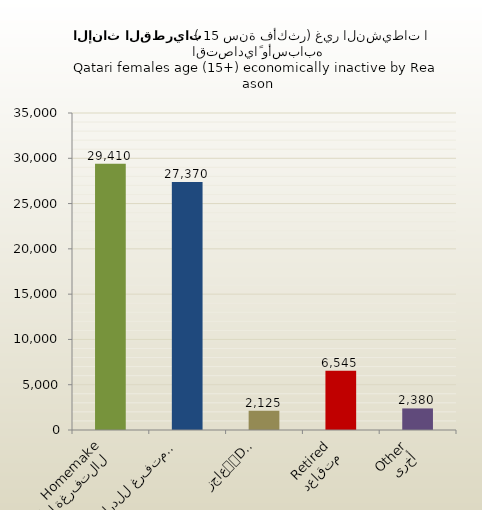
| Category | الاناث القطريات |
|---|---|
| التفرغة لأعمال المنزل
Homemaker | 29410 |
| متفرغ للدراسة
Student | 27370 |
| عاجز
Disabled | 2125 |
| متقاعد
Retired | 6545 |
| أخرى
Other | 2380 |